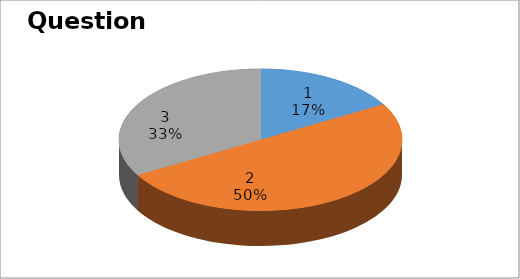
| Category | Series 0 |
|---|---|
| 0 | 1 |
| 1 | 3 |
| 2 | 2 |